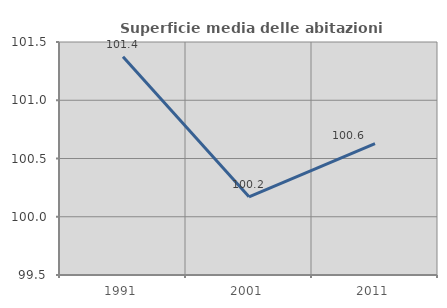
| Category | Superficie media delle abitazioni occupate |
|---|---|
| 1991.0 | 101.372 |
| 2001.0 | 100.171 |
| 2011.0 | 100.628 |